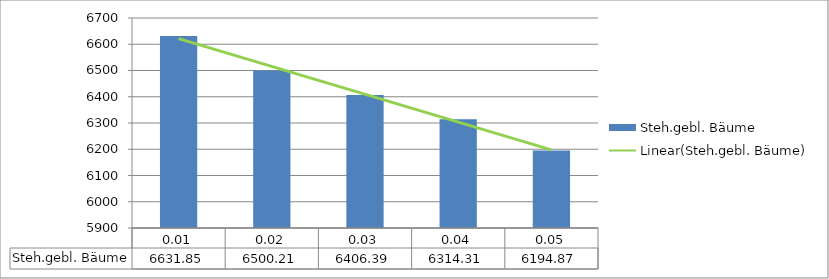
| Category | Steh.gebl. Bäume |
|---|---|
| 0.01 | 6631.85 |
| 0.02 | 6500.21 |
| 0.03 | 6406.39 |
| 0.04 | 6314.31 |
| 0.05 | 6194.87 |